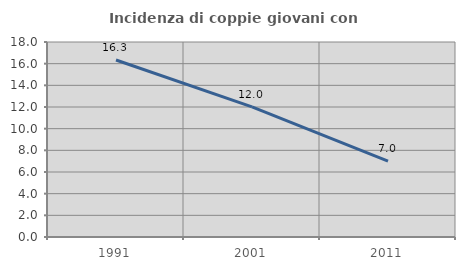
| Category | Incidenza di coppie giovani con figli |
|---|---|
| 1991.0 | 16.336 |
| 2001.0 | 12.015 |
| 2011.0 | 7.008 |